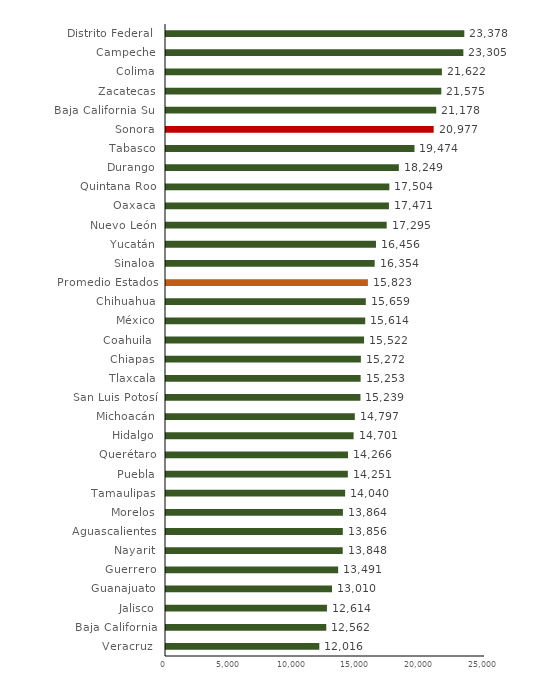
| Category | Gasto percápita |
|---|---|
| Veracruz  | 12016.058 |
| Baja California | 12561.835 |
| Jalisco | 12614.127 |
| Guanajuato | 13010.156 |
| Guerrero | 13490.979 |
| Nayarit | 13848.379 |
| Aguascalientes | 13856.431 |
| Morelos | 13864.316 |
| Tamaulipas | 14039.966 |
| Puebla | 14251.367 |
| Querétaro | 14266.371 |
| Hidalgo | 14701.383 |
| Michoacán | 14797.051 |
| San Luis Potosí | 15238.782 |
| Tlaxcala | 15253.114 |
| Chiapas | 15271.646 |
| Coahuila  | 15522.263 |
| México | 15613.697 |
| Chihuahua | 15658.698 |
| Promedio Estados | 15822.914 |
| Sinaloa | 16354.419 |
| Yucatán | 16455.625 |
| Nuevo León | 17295.068 |
| Oaxaca | 17470.666 |
| Quintana Roo | 17503.833 |
| Durango | 18249.43 |
| Tabasco | 19473.71 |
| Sonora | 20977.06 |
| Baja California Sur | 21178.003 |
| Zacatecas | 21575.485 |
| Colima | 21622.479 |
| Campeche | 23304.794 |
| Distrito Federal  | 23377.753 |